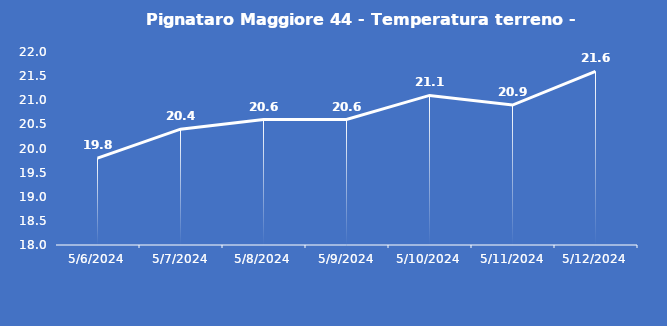
| Category | Pignataro Maggiore 44 - Temperatura terreno - Grezzo (°C) |
|---|---|
| 5/6/24 | 19.8 |
| 5/7/24 | 20.4 |
| 5/8/24 | 20.6 |
| 5/9/24 | 20.6 |
| 5/10/24 | 21.1 |
| 5/11/24 | 20.9 |
| 5/12/24 | 21.6 |